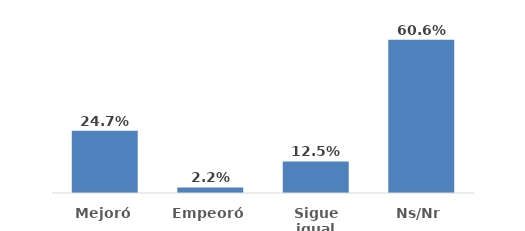
| Category | Series 0 |
|---|---|
| Mejoró | 0.247 |
| Empeoró | 0.022 |
| Sigue igual | 0.125 |
| Ns/Nr | 0.606 |